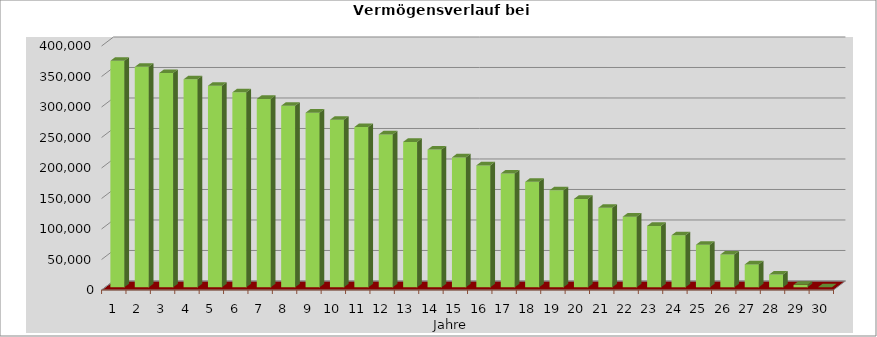
| Category | Series 0 |
|---|---|
| 1.0 | 371300.606 |
| 2.0 | 361386.618 |
| 3.0 | 351274.351 |
| 4.0 | 340959.838 |
| 5.0 | 330439.035 |
| 6.0 | 319707.815 |
| 7.0 | 308761.972 |
| 8.0 | 297597.211 |
| 9.0 | 286209.155 |
| 10.0 | 274593.338 |
| 11.0 | 262745.205 |
| 12.0 | 250660.109 |
| 13.0 | 238333.311 |
| 14.0 | 225759.978 |
| 15.0 | 212935.177 |
| 16.0 | 199853.881 |
| 17.0 | 186510.958 |
| 18.0 | 172901.177 |
| 19.0 | 159019.201 |
| 20.0 | 144859.585 |
| 21.0 | 130416.777 |
| 22.0 | 115685.112 |
| 23.0 | 100658.814 |
| 24.0 | 85331.991 |
| 25.0 | 69698.631 |
| 26.0 | 53752.603 |
| 27.0 | 37487.655 |
| 28.0 | 20897.408 |
| 29.0 | 3975.356 |
| 30.0 | 0 |